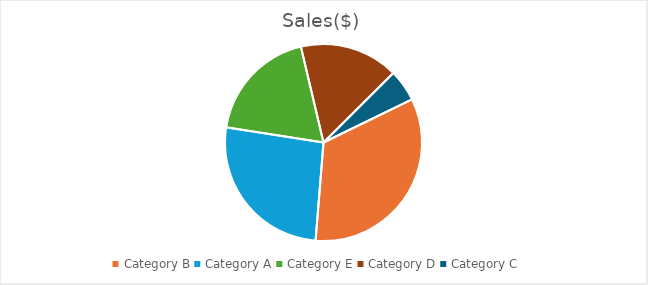
| Category | Sales($) |
|---|---|
| Category B | 3200 |
| Category A | 2500 |
| Category E | 1800 |
| Category D | 1550 |
| Category C | 500 |